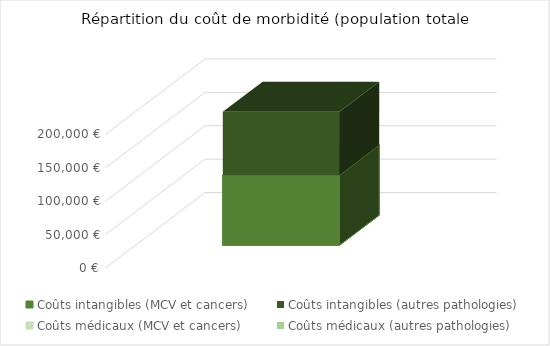
| Category | Coûts intangibles (MCV et cancers) | Coûts intangibles (autres pathologies) | Coûts médicaux (MCV et cancers) | Coûts médicaux (autres pathologies) |
|---|---|---|---|---|
| 0 | 105114.449 | 304867.891 | 48063.003 | 72403.893 |